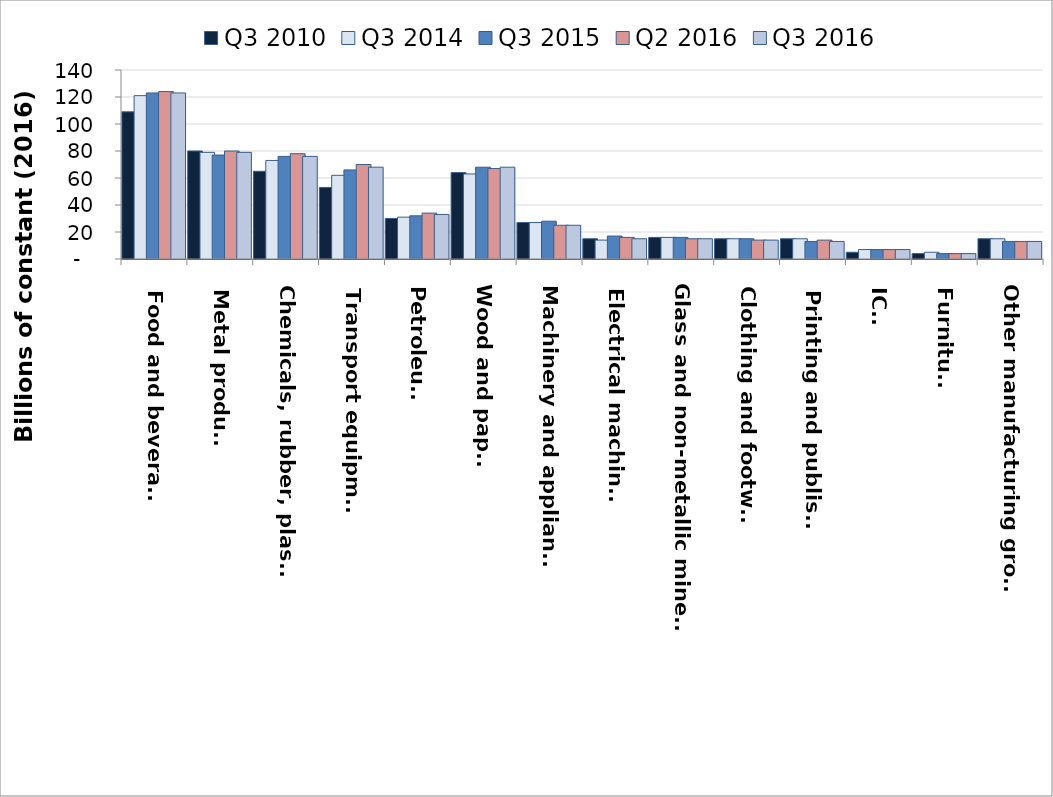
| Category | Q3 2010 | Q3 2014 | Q3 2015 | Q2 2016 | Q3 2016 |
|---|---|---|---|---|---|
| Food and beverages | 109 | 121 | 123 | 124 | 123 |
| Metal products | 80 | 79 | 77 | 80 | 79 |
| Chemicals, rubber, plastics | 65 | 73 | 76 | 78 | 76 |
| Transport equipment | 53 | 62 | 66 | 70 | 68 |
| Petroleum | 30 | 31 | 32 | 34 | 33 |
| Wood and paper | 64 | 63 | 68 | 67 | 68 |
| Machinery and appliances | 27 | 27 | 28 | 25 | 25 |
| Electrical machinery | 15 | 14 | 17 | 16 | 15 |
| Glass and non-metallic minerals | 16 | 16 | 16 | 15 | 15 |
| Clothing and footwear | 15 | 15 | 15 | 14 | 14 |
| Printing and publishing | 15 | 15 | 13 | 14 | 13 |
| ICT | 5 | 7 | 7 | 7 | 7 |
| Furniture | 4 | 5 | 4 | 4 | 4 |
| Other manufacturing groups | 15 | 15 | 13 | 13 | 13 |